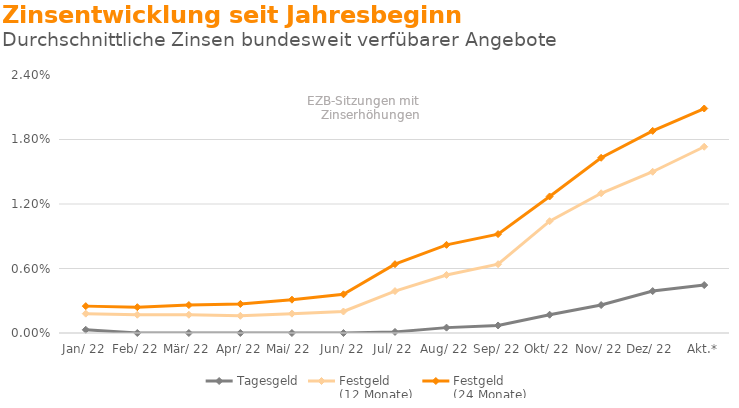
| Category | Tagesgeld | Festgeld 
(12 Monate) | Festgeld 
(24 Monate) |
|---|---|---|---|
| Jan. 22 | 0 | 0.002 | 0.002 |
| Feb. 22 | 0 | 0.002 | 0.002 |
| Mrz. 22 | 0 | 0.002 | 0.003 |
| Apr. 22 | 0 | 0.002 | 0.003 |
| Mai. 22 | 0 | 0.002 | 0.003 |
| Jun. 22 | 0 | 0.002 | 0.004 |
| Jul. 22 | 0 | 0.004 | 0.006 |
| Aug. 22 | 0 | 0.005 | 0.008 |
| Sep. 22 | 0.001 | 0.006 | 0.009 |
| Okt. 22 | 0.002 | 0.01 | 0.013 |
| Nov. 22 | 0.003 | 0.013 | 0.016 |
| Dez. 22 | 0.004 | 0.015 | 0.019 |
| Akt.* | 0.004 | 0.017 | 0.021 |